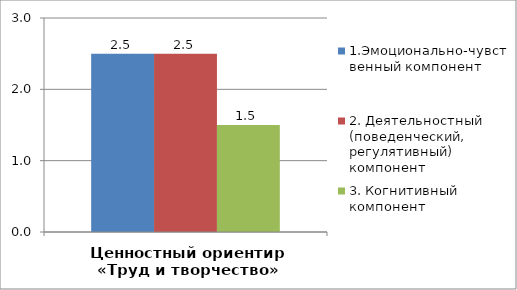
| Category | 1.Эмоционально-чувственный компонент | 2. Деятельностный (поведенческий, регулятивный) компонент | 3. Когнитивный компонент |
|---|---|---|---|
| Ценностный ориентир «Труд и творчество» | 2.5 | 2.5 | 1.5 |